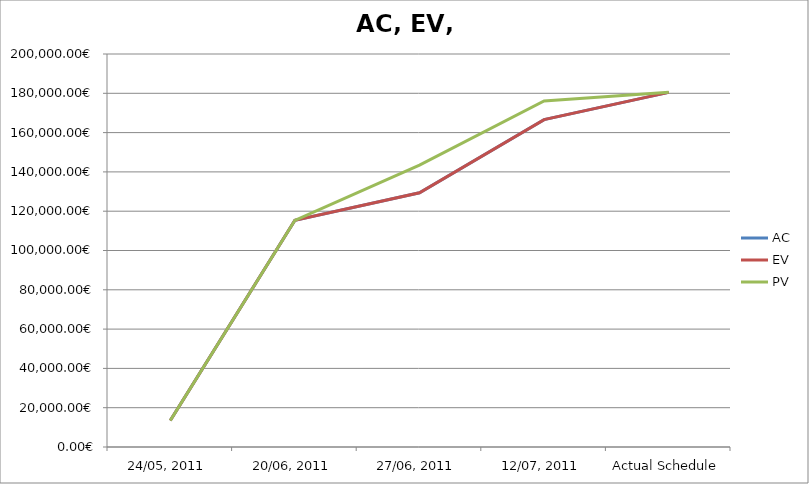
| Category | AC | EV | PV |
|---|---|---|---|
| 24/05, 2011 | 13526.64 | 13526.64 | 13526.64 |
| 20/06, 2011 | 115357.89 | 115357.89 | 115357.89 |
| 27/06, 2011 | 129405.89 | 129405.89 | 143433.17 |
| 12/07, 2011 | 166619.97 | 166619.97 | 176069.27 |
| Actual Schedule | 180485.27 | 180485.27 | 180485.27 |